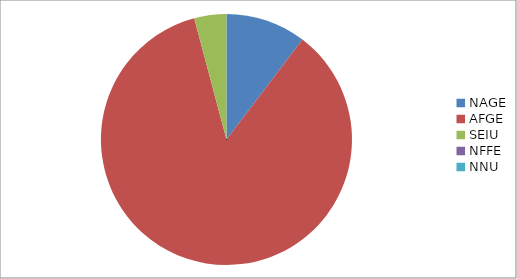
| Category | Series 0 |
|---|---|
| NAGE | 1085 |
| AFGE | 8975 |
| SEIU | 435 |
| NFFE | 0 |
| NNU | 0 |